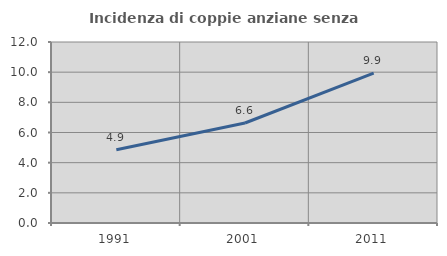
| Category | Incidenza di coppie anziane senza figli  |
|---|---|
| 1991.0 | 4.85 |
| 2001.0 | 6.631 |
| 2011.0 | 9.937 |